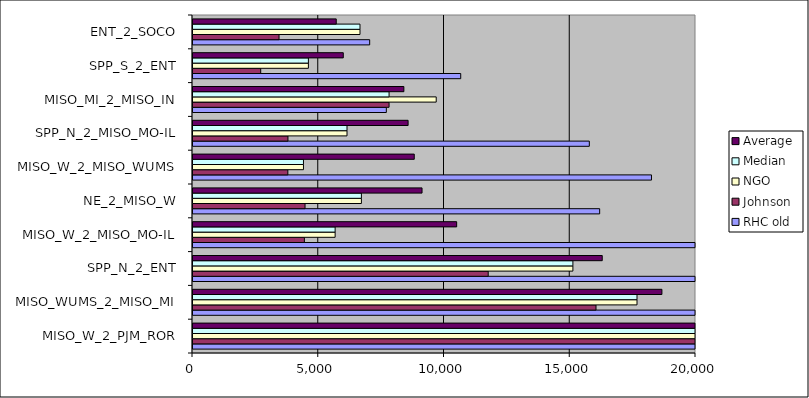
| Category | RHC old | Johnson | NGO | Median | Average |
|---|---|---|---|---|---|
| MISO_W_2_PJM_ROR | 53786.97 | 23477.094 | 30870.55 | 30870.55 | 36044.871 |
| MISO_WUMS_2_MISO_MI | 22255.305 | 16024.206 | 17654.21 | 17654.21 | 18644.574 |
| SPP_N_2_ENT | 21973.3 | 11737.949 | 15105.53 | 15105.53 | 16272.26 |
| MISO_W_2_MISO_MO-IL | 21371.275 | 4428.617 | 5651.29 | 5651.29 | 10483.727 |
| NE_2_MISO_W | 16169.695 | 4454.537 | 6695.65 | 6695.65 | 9106.627 |
| MISO_W_2_MISO_WUMS | 18229.42 | 3771.348 | 4392.1 | 4392.1 | 8797.623 |
| SPP_N_2_MISO_MO-IL | 15758.26 | 3775.783 | 6123.8 | 6123.8 | 8552.614 |
| MISO_MI_2_MISO_IN | 7687.32 | 7795.91 | 9670.57 | 7795.91 | 8384.6 |
| SPP_S_2_ENT | 10645.295 | 2692.541 | 4588.71 | 4588.71 | 5975.515 |
| ENT_2_SOCO | 7024.98 | 3421.339 | 6639.87 | 6639.87 | 5695.396 |